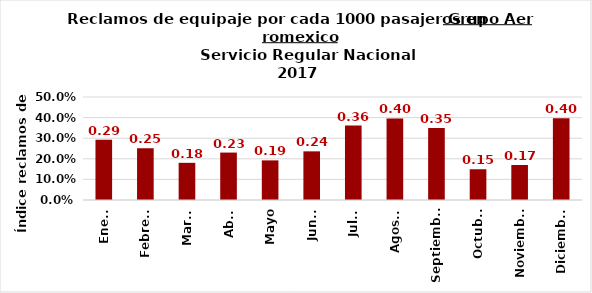
| Category | Reclamos por cada 1000 pasajeros |
|---|---|
| Enero | 0.293 |
| Febrero | 0.251 |
| Marzo | 0.18 |
| Abril | 0.23 |
| Mayo | 0.192 |
| Junio | 0.236 |
| Julio | 0.362 |
| Agosto | 0.396 |
| Septiembre | 0.349 |
| Octubre | 0.149 |
| Noviembre | 0.17 |
| Diciembre | 0.397 |